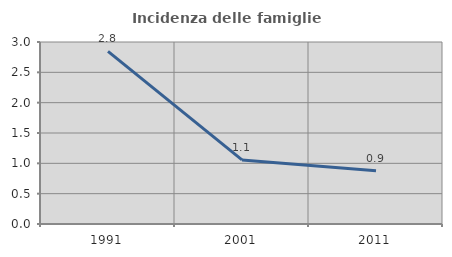
| Category | Incidenza delle famiglie numerose |
|---|---|
| 1991.0 | 2.844 |
| 2001.0 | 1.056 |
| 2011.0 | 0.877 |